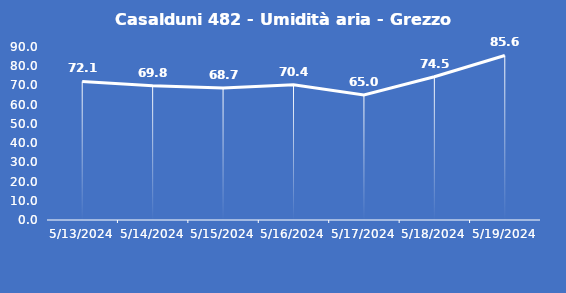
| Category | Casalduni 482 - Umidità aria - Grezzo (%) |
|---|---|
| 5/13/24 | 72.1 |
| 5/14/24 | 69.8 |
| 5/15/24 | 68.7 |
| 5/16/24 | 70.4 |
| 5/17/24 | 65 |
| 5/18/24 | 74.5 |
| 5/19/24 | 85.6 |